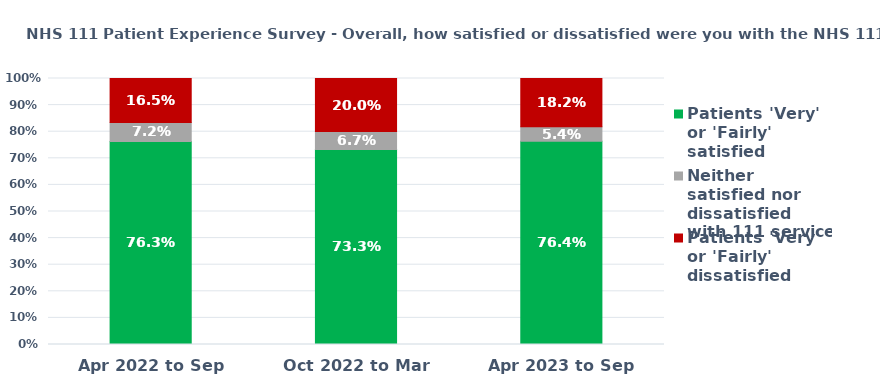
| Category | Patients 'Very' or 'Fairly' satisfied | Neither satisfied nor dissatisfied with 111 service | Patients 'Very' or 'Fairly' dissatisfied |
|---|---|---|---|
| Apr 2022 to Sep 2022 | 0.763 | 0.072 | 0.165 |
| Oct 2022 to Mar 2023 | 0.733 | 0.067 | 0.2 |
| Apr 2023 to Sep 2023 | 0.764 | 0.054 | 0.182 |